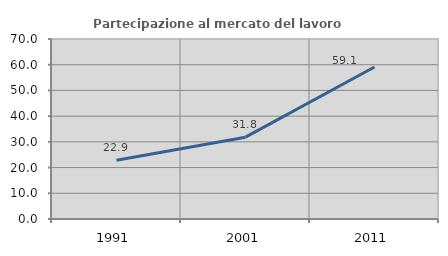
| Category | Partecipazione al mercato del lavoro  femminile |
|---|---|
| 1991.0 | 22.857 |
| 2001.0 | 31.818 |
| 2011.0 | 59.091 |